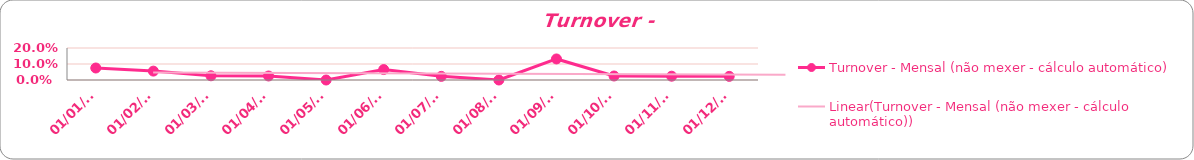
| Category | Turnover - Mensal (não mexer - cálculo automático) |
|---|---|
| 2023-01-31 | 0.075 |
| 2023-02-28 | 0.056 |
| 2023-03-31 | 0.026 |
| 2023-04-30 | 0.025 |
| 2023-05-31 | 0 |
| 2023-06-30 | 0.065 |
| 2023-07-31 | 0.023 |
| 2023-08-31 | 0 |
| 2023-09-30 | 0.132 |
| 2023-10-31 | 0.025 |
| 2023-11-30 | 0.024 |
| 2023-12-31 | 0.023 |